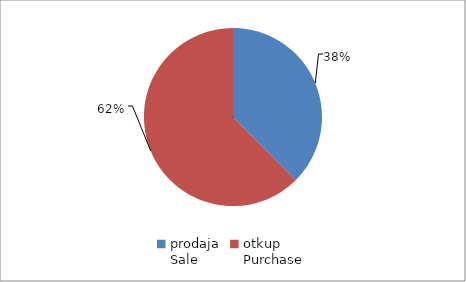
| Category | Series 0 |
|---|---|
| prodaja
Sale | 12084468 |
| otkup
Purchase | 20096437 |